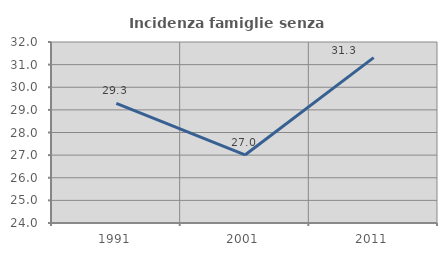
| Category | Incidenza famiglie senza nuclei |
|---|---|
| 1991.0 | 29.284 |
| 2001.0 | 27.008 |
| 2011.0 | 31.31 |